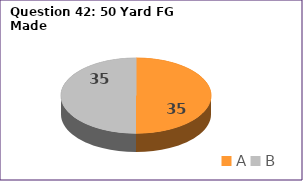
| Category | Series 0 |
|---|---|
| A | 35 |
| B | 35 |